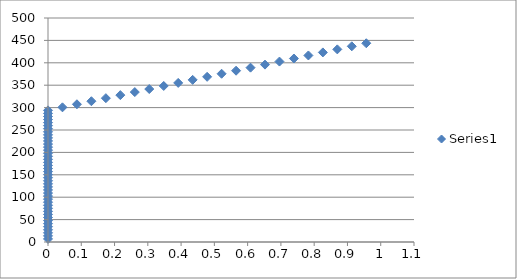
| Category | Series 0 |
|---|---|
| 0.0 | 6.833 |
| 0.0 | 13.667 |
| 0.0 | 20.5 |
| 0.0 | 27.333 |
| 0.0 | 34.167 |
| 0.0 | 41 |
| 0.0 | 47.833 |
| 0.0 | 54.667 |
| 0.0 | 61.5 |
| 0.0 | 68.333 |
| 0.0 | 75.167 |
| 0.0 | 82 |
| 0.0 | 88.833 |
| 0.0 | 95.667 |
| 0.0 | 102.5 |
| 0.0 | 109.333 |
| 0.0 | 116.167 |
| 0.0 | 123 |
| 0.0 | 129.833 |
| 0.0 | 136.667 |
| 0.0 | 143.5 |
| 0.0 | 150.333 |
| 0.0 | 157.167 |
| 0.0 | 164 |
| 0.0 | 170.833 |
| 0.0 | 177.667 |
| 0.0 | 184.5 |
| 0.0 | 191.333 |
| 0.0 | 198.167 |
| 0.0 | 205 |
| 0.0 | 211.833 |
| 0.0 | 218.667 |
| 0.0 | 225.5 |
| 0.0 | 232.333 |
| 0.0 | 239.167 |
| 0.0 | 246 |
| 0.0 | 252.833 |
| 0.0 | 259.667 |
| 0.0 | 266.5 |
| 0.0 | 273.333 |
| 0.0 | 280.167 |
| 0.0 | 287 |
| 0.0 | 293.81 |
| 0.04347826086956519 | 300.619 |
| 0.08695652173913049 | 307.429 |
| 0.13043478260869568 | 314.238 |
| 0.17391304347826086 | 321.048 |
| 0.21739130434782605 | 327.857 |
| 0.26086956521739135 | 334.667 |
| 0.30434782608695654 | 341.476 |
| 0.34782608695652173 | 348.286 |
| 0.3913043478260869 | 355.095 |
| 0.4347826086956522 | 361.905 |
| 0.4782608695652174 | 368.714 |
| 0.5217391304347826 | 375.524 |
| 0.5652173913043479 | 382.333 |
| 0.6086956521739131 | 389.143 |
| 0.6521739130434783 | 395.952 |
| 0.6956521739130435 | 402.762 |
| 0.7391304347826086 | 409.571 |
| 0.782608695652174 | 416.381 |
| 0.8260869565217391 | 423.19 |
| 0.8695652173913043 | 430 |
| 0.9130434782608696 | 436.81 |
| 0.9565217391304348 | 443.619 |